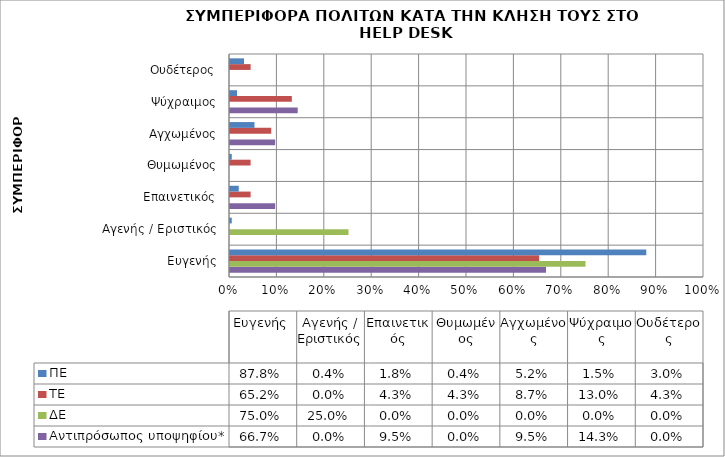
| Category | Αντιπρόσωπος υποψηφίου* | ΔΕ | ΤΕ | ΠΕ |
|---|---|---|---|---|
| Ευγενής | 0.667 | 0.75 | 0.652 | 0.878 |
| Αγενής / Εριστικός | 0 | 0.25 | 0 | 0.004 |
| Επαινετικός | 0.095 | 0 | 0.043 | 0.018 |
| Θυμωμένος | 0 | 0 | 0.043 | 0.004 |
| Αγχωμένος | 0.095 | 0 | 0.087 | 0.052 |
| Ψύχραιμος | 0.143 | 0 | 0.13 | 0.015 |
| Ουδέτερος | 0 | 0 | 0.043 | 0.03 |